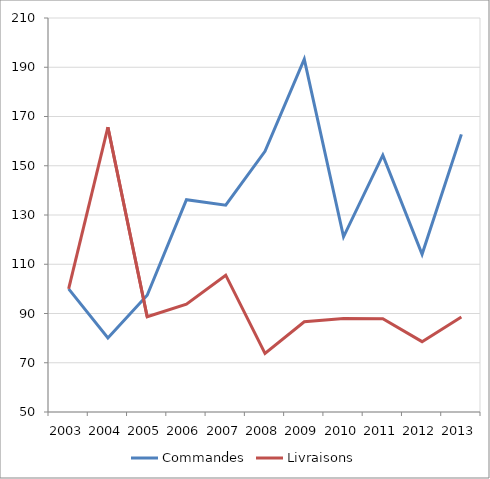
| Category | Commandes | Livraisons |
|---|---|---|
| 2003.0 | 100 | 100 |
| 2004.0 | 80.066 | 165.659 |
| 2005.0 | 97.396 | 88.7 |
| 2006.0 | 136.222 | 93.792 |
| 2007.0 | 133.996 | 105.557 |
| 2008.0 | 155.871 | 73.774 |
| 2009.0 | 193.284 | 86.631 |
| 2010.0 | 121.155 | 87.956 |
| 2011.0 | 154.283 | 87.845 |
| 2012.0 | 114.044 | 78.565 |
| 2013.0 | 162.734 | 88.556 |